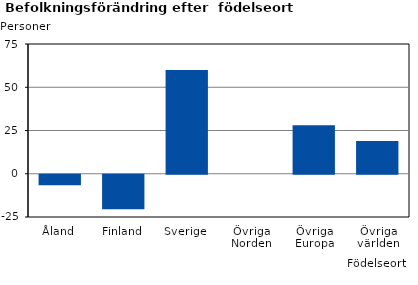
| Category | Series 0 |
|---|---|
| Åland | -6 |
| Finland | -20 |
| Sverige | 60 |
| Övriga Norden | 0 |
| Övriga Europa | 28 |
| Övriga världen | 19 |